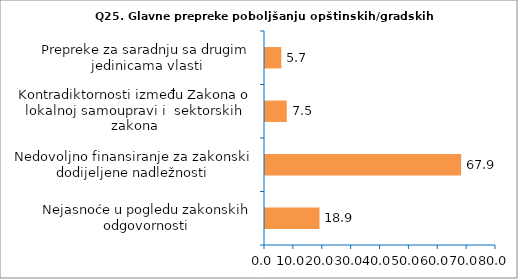
| Category | Series 0 |
|---|---|
| Nejasnoće u pogledu zakonskih odgovornosti | 18.868 |
| Nedovoljno finansiranje za zakonski dodijeljene nadležnosti | 67.925 |
| Kontradiktornosti između Zakona o lokalnoj samoupravi i  sektorskih zakona | 7.547 |
| Prepreke za saradnju sa drugim jedinicama vlasti | 5.66 |